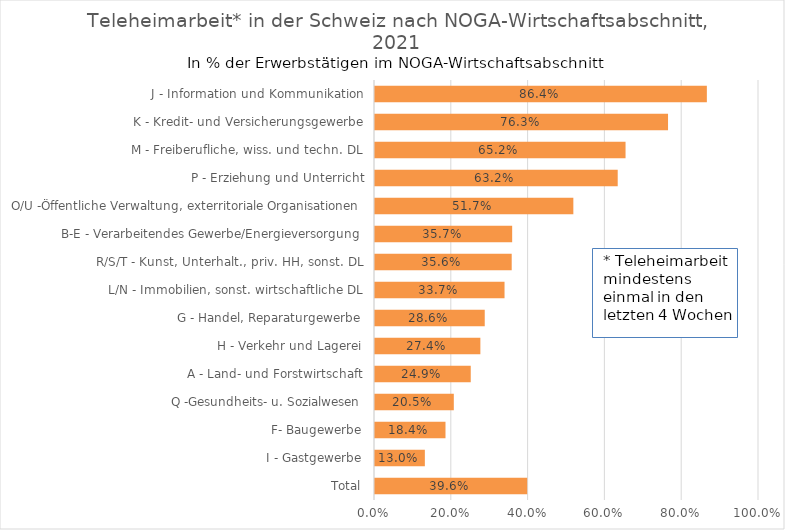
| Category | Total Teleheimarbeit (2) |
|---|---|
| Total | 0.396 |
| I - Gastgewerbe | 0.13 |
| F- Baugewerbe | 0.184 |
| Q -Gesundheits- u. Sozialwesen | 0.205 |
| A - Land- und Forstwirtschaft | 0.249 |
| H - Verkehr und Lagerei | 0.274 |
| G - Handel, Reparaturgewerbe | 0.286 |
| L/N - Immobilien, sonst. wirtschaftliche DL | 0.337 |
| R/S/T - Kunst, Unterhalt., priv. HH, sonst. DL | 0.356 |
| B-E - Verarbeitendes Gewerbe/Energieversorgung | 0.357 |
| O/U -Öffentliche Verwaltung, exterritoriale Organisationen | 0.517 |
| P - Erziehung und Unterricht | 0.632 |
| M - Freiberufliche, wiss. und techn. DL | 0.652 |
| K - Kredit- und Versicherungsgewerbe | 0.763 |
| J - Information und Kommunikation | 0.864 |